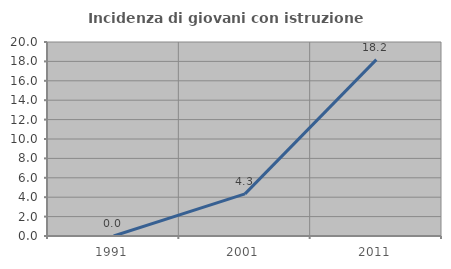
| Category | Incidenza di giovani con istruzione universitaria |
|---|---|
| 1991.0 | 0 |
| 2001.0 | 4.348 |
| 2011.0 | 18.182 |